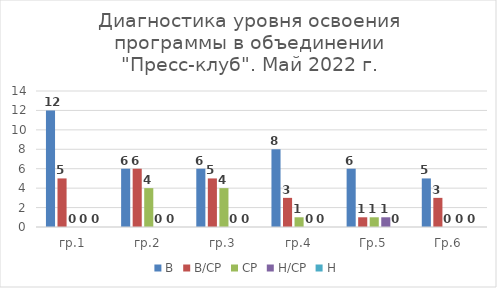
| Category | В | В/СР | СР | Н/СР | Н |
|---|---|---|---|---|---|
| гр.1 | 12 | 5 | 0 | 0 | 0 |
| гр.2 | 6 | 6 | 4 | 0 | 0 |
| гр.3 | 6 | 5 | 4 | 0 | 0 |
| гр.4 | 8 | 3 | 1 | 0 | 0 |
| Гр.5 | 6 | 1 | 1 | 1 | 0 |
| Гр.6 | 5 | 3 | 0 | 0 | 0 |